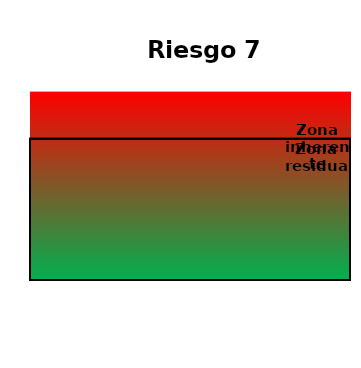
| Category | Zona  | Zona Residual | Zona inherente |
|---|---|---|---|
| Riesgo 7 | 4 | 3 | 3 |